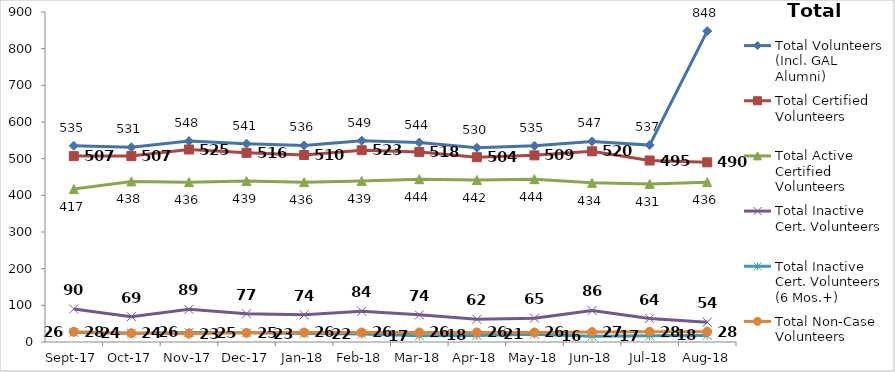
| Category | Total Volunteers (Incl. GAL Alumni) | Total Certified Volunteers | Total Active Certified Volunteers | Total Inactive Cert. Volunteers | Total Inactive Cert. Volunteers (6 Mos.+) | Total Non-Case Volunteers |
|---|---|---|---|---|---|---|
| 2017-09-01 | 535 | 507 | 417 | 90 | 26 | 28 |
| 2017-10-01 | 531 | 507 | 438 | 69 | 24 | 24 |
| 2017-11-01 | 548 | 525 | 436 | 89 | 26 | 23 |
| 2017-12-01 | 541 | 516 | 439 | 77 | 25 | 25 |
| 2018-01-01 | 536 | 510 | 436 | 74 | 23 | 26 |
| 2018-02-01 | 549 | 523 | 439 | 84 | 22 | 26 |
| 2018-03-01 | 544 | 518 | 444 | 74 | 17 | 26 |
| 2018-04-01 | 530 | 504 | 442 | 62 | 18 | 26 |
| 2018-05-01 | 535 | 509 | 444 | 65 | 21 | 26 |
| 2018-06-01 | 547 | 520 | 434 | 86 | 16 | 27 |
| 2018-07-01 | 537 | 495 | 431 | 64 | 17 | 28 |
| 2018-08-01 | 848 | 490 | 436 | 54 | 18 | 28 |